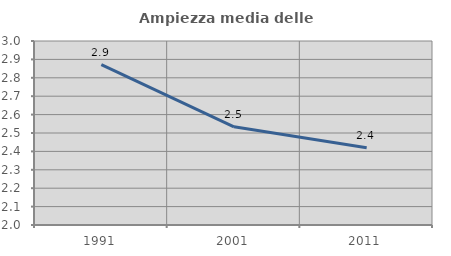
| Category | Ampiezza media delle famiglie |
|---|---|
| 1991.0 | 2.871 |
| 2001.0 | 2.534 |
| 2011.0 | 2.42 |